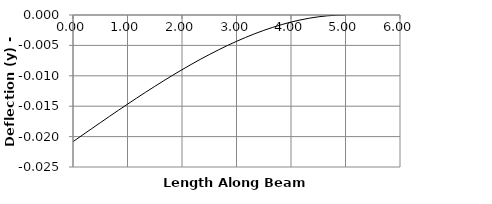
| Category | y |
|---|---|
| 0.0 | -0.021 |
| 1e-05 | -0.021 |
| 0.16666666666666666 | -0.02 |
| 0.3333333333333333 | -0.019 |
| 0.5 | -0.018 |
| 0.6666666666666666 | -0.017 |
| 0.8333333333333333 | -0.016 |
| 1.0 | -0.015 |
| 1.1666666666666665 | -0.014 |
| 1.3333333333333333 | -0.013 |
| 1.5 | -0.012 |
| 1.6666666666666665 | -0.011 |
| 1.8333333333333333 | -0.01 |
| 2.0 | -0.009 |
| 2.1666666666666665 | -0.008 |
| 2.333333333333333 | -0.007 |
| 2.5 | -0.007 |
| 2.6666666666666665 | -0.006 |
| 2.833333333333333 | -0.005 |
| 3.0 | -0.004 |
| 3.1666666666666665 | -0.004 |
| 3.333333333333333 | -0.003 |
| 3.5 | -0.003 |
| 3.6666666666666665 | -0.002 |
| 3.833333333333333 | -0.002 |
| 4.0 | -0.001 |
| 4.166666666666666 | -0.001 |
| 4.333333333333333 | -0.001 |
| 4.5 | 0 |
| 4.666666666666666 | 0 |
| 4.833333333333333 | 0 |
| 5.0 | 0 |